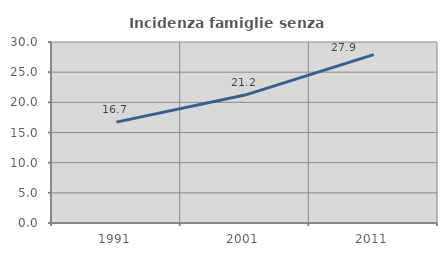
| Category | Incidenza famiglie senza nuclei |
|---|---|
| 1991.0 | 16.721 |
| 2001.0 | 21.202 |
| 2011.0 | 27.897 |